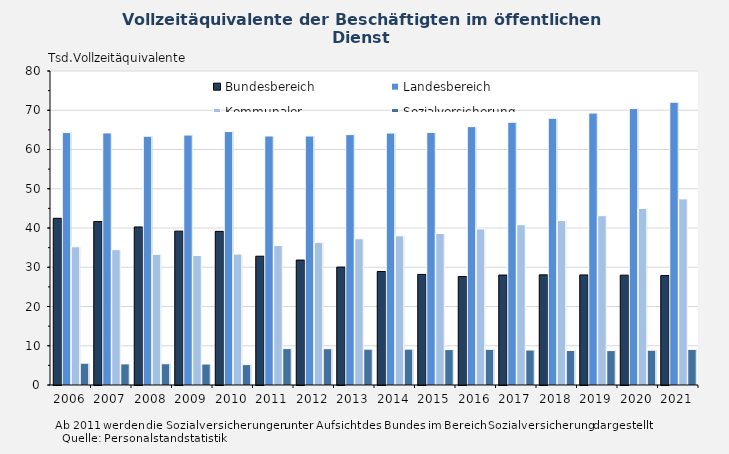
| Category | Bundesbereich | Landesbereich | Kommunaler 
Bereich | Sozialversicherung |
|---|---|---|---|---|
| 2006-12-31 | 42.472 | 64.316 | 35.215 | 5.557 |
| 2007-12-31 | 41.641 | 64.225 | 34.483 | 5.371 |
| 2008-12-31 | 40.266 | 63.383 | 33.289 | 5.42 |
| 2009-12-31 | 39.199 | 63.685 | 32.995 | 5.343 |
| 2010-12-31 | 39.141 | 64.573 | 33.365 | 5.2 |
| 2011-12-31 | 32.813 | 63.44 | 35.538 | 9.276 |
| 2012-12-31 | 31.828 | 63.433 | 36.347 | 9.254 |
| 2013-12-31 | 30.038 | 63.793 | 37.254 | 9.125 |
| 2014-12-31 | 28.914 | 64.194 | 38.001 | 9.144 |
| 2015-12-31 | 28.172 | 64.342 | 38.599 | 9.023 |
| 2016-12-31 | 27.637 | 65.825 | 39.764 | 9.092 |
| 2017-12-31 | 28.012 | 66.946 | 40.83 | 8.912 |
| 2018-12-31 | 28.061 | 67.958 | 41.891 | 8.789 |
| 2019-12-31 | 28.041 | 69.285 | 43.14 | 8.769 |
| 2020-12-31 | 27.985 | 70.44 | 45 | 8.87 |
| 2021-12-31 | 27.875 | 72.059 | 47.419 | 9.079 |